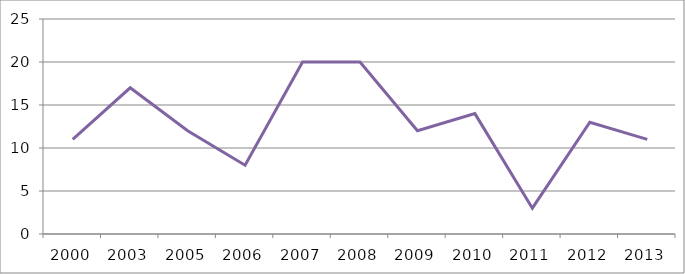
| Category | Produção geral |
|---|---|
| 2000.0 | 11 |
| 2003.0 | 17 |
| 2005.0 | 12 |
| 2006.0 | 8 |
| 2007.0 | 20 |
| 2008.0 | 20 |
| 2009.0 | 12 |
| 2010.0 | 14 |
| 2011.0 | 3 |
| 2012.0 | 13 |
| 2013.0 | 11 |